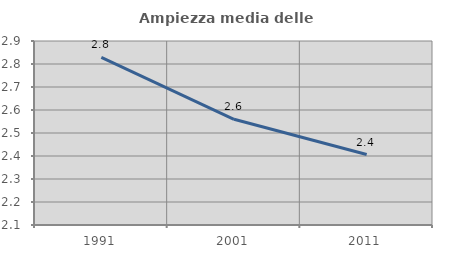
| Category | Ampiezza media delle famiglie |
|---|---|
| 1991.0 | 2.829 |
| 2001.0 | 2.56 |
| 2011.0 | 2.406 |